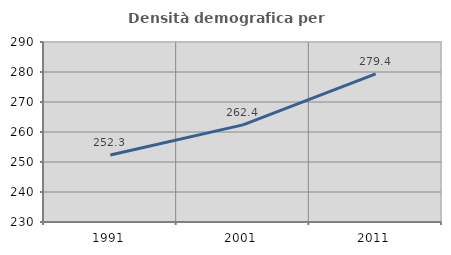
| Category | Densità demografica |
|---|---|
| 1991.0 | 252.315 |
| 2001.0 | 262.366 |
| 2011.0 | 279.371 |